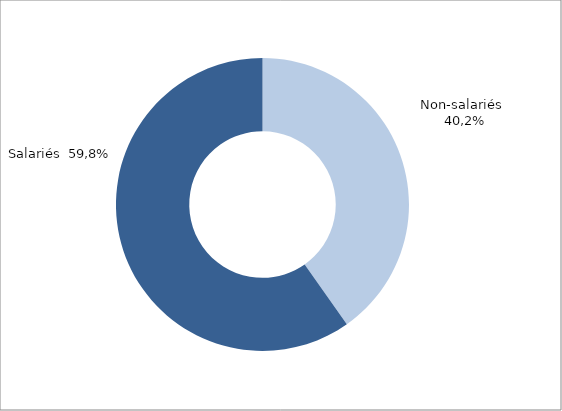
| Category | Series 0 |
|---|---|
| Non-salariés | 1281283 |
| Salariés | 1903046 |